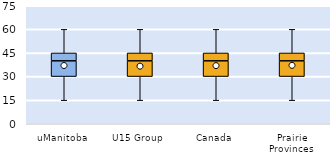
| Category | 25th | 50th | 75th |
|---|---|---|---|
| uManitoba | 30 | 10 | 5 |
| U15 Group | 30 | 10 | 5 |
| Canada | 30 | 10 | 5 |
| Prairie Provinces | 30 | 10 | 5 |